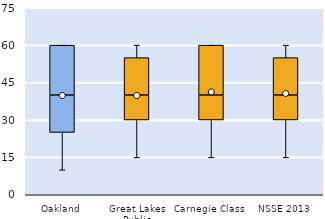
| Category | 25th | 50th | 75th |
|---|---|---|---|
| Oakland | 25 | 15 | 20 |
| Great Lakes Public | 30 | 10 | 15 |
| Carnegie Class | 30 | 10 | 20 |
| NSSE 2013 | 30 | 10 | 15 |